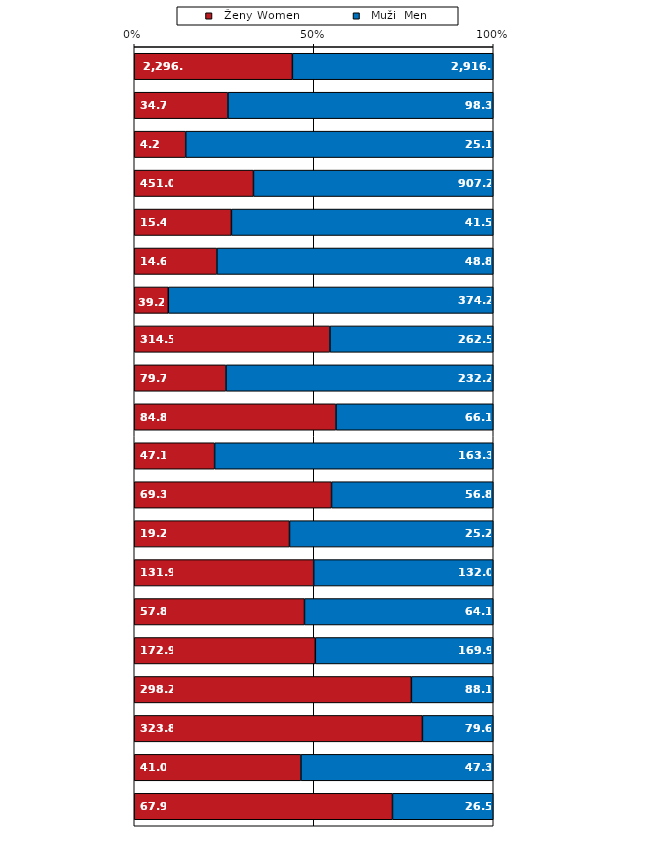
| Category |   Ženy Women |   Muži  Men |
|---|---|---|
| Zemědělství, lesnictví 
  a rybářství | 2296.4 | 2916.9 |
| Těžba a dobývání | 34.7 | 98.3 |
| Zpracovatelský průmysl | 4.2 | 25.1 |
| Výroba a rozvod elektřiny
  plynu, tepla a 
  klimatizovaného vzduchu | 451 | 907.2 |
| Zásobování vodou,
  činnosti souv. s 
  odpadními vodami,
  odpady a sanacemi
   elektřiny, plynu a 
   vody | 15.4 | 41.5 |
| Stavebnictví | 14.6 | 48.8 |
| Velkoobchod a
  maloobchod; opravy
  a údržba motorových
  vozidel | 39.2 | 374.2 |
| Doprava a skladování | 314.5 | 262.5 |
| Ubytování, stravování
  a pohostinství | 79.7 | 232.2 |
| Informační a komunikační
  činnosti | 84.8 | 66.1 |
| Peněžnictví a
  pojišťovnictví | 47.1 | 163.3 |
| Činnosti v oblasti
  nemovitostí | 69.3 | 56.8 |
| Profesní, vědecké
  a technické činosti | 19.2 | 25.2 |
| Administrativní a
  podpůrné činnosti | 131.9 | 132 |
| Veřejná správa a obrana;
  povinné sociální
  zabezpečení | 57.8 | 64.1 |
| Vzdělávání | 172.9 | 169.9 |
| Zdravotní a sociální péče
  | 298.2 | 88.1 |
| Kulturní, zábavní
  a rekreační činnosti | 323.8 | 79.6 |
| Ostatní činnosti | 41 | 47.3 |